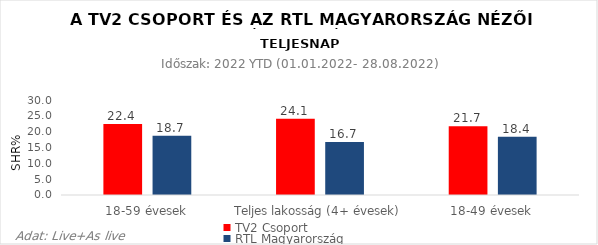
| Category | TV2 Csoport | RTL Magyarország |
|---|---|---|
| 18-59 évesek | 22.4 | 18.7 |
| Teljes lakosság (4+ évesek) | 24.1 | 16.7 |
| 18-49 évesek | 21.7 | 18.4 |